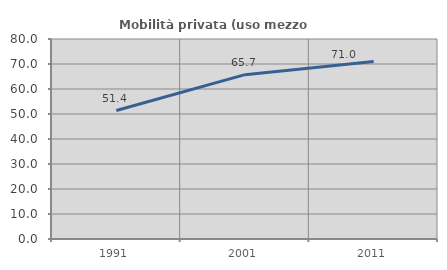
| Category | Mobilità privata (uso mezzo privato) |
|---|---|
| 1991.0 | 51.385 |
| 2001.0 | 65.746 |
| 2011.0 | 71.041 |